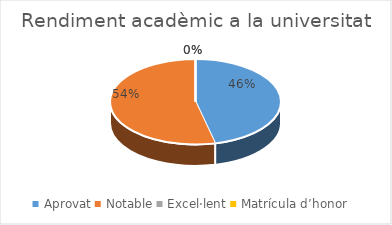
| Category | Series 0 |
|---|---|
| Aprovat | 44 |
| Notable | 51 |
| Excel·lent | 0 |
| Matrícula d’honor | 0 |